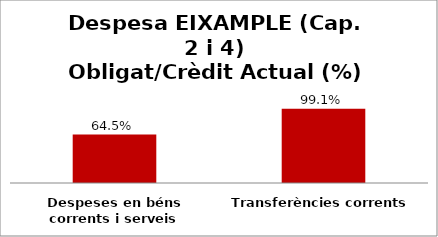
| Category | Series 0 |
|---|---|
| Despeses en béns corrents i serveis | 0.645 |
| Transferències corrents | 0.991 |